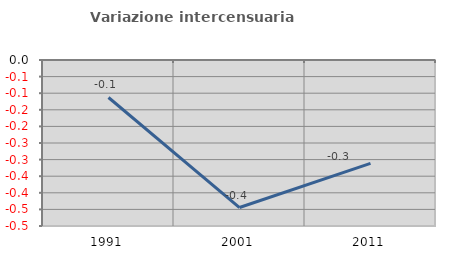
| Category | Variazione intercensuaria annua |
|---|---|
| 1991.0 | -0.113 |
| 2001.0 | -0.444 |
| 2011.0 | -0.311 |